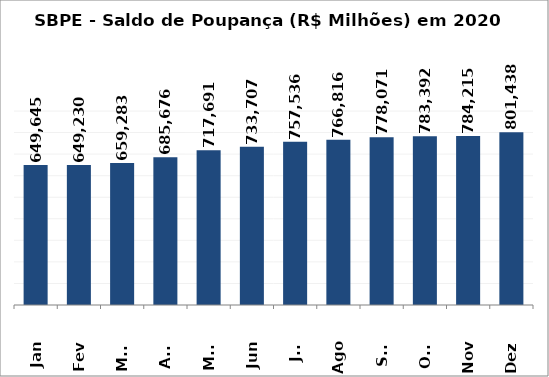
| Category | SBPE - Saldo de Poupança (R$ Milhões) em 2020 |
|---|---|
| Jan | 649645.04 |
| Fev | 649229.63 |
| Mar | 659283.469 |
| Abr | 685675.702 |
| Mai | 717690.899 |
| Jun | 733706.661 |
| Jul | 757535.898 |
| Ago | 766816.29 |
| Set | 778070.686 |
| Out | 783392.278 |
| Nov | 784215.225 |
| Dez | 801437.985 |